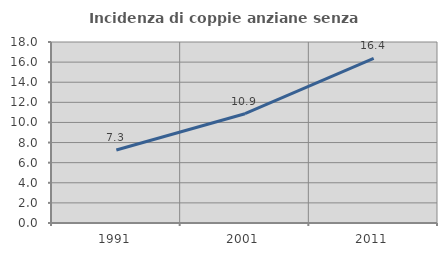
| Category | Incidenza di coppie anziane senza figli  |
|---|---|
| 1991.0 | 7.26 |
| 2001.0 | 10.867 |
| 2011.0 | 16.368 |